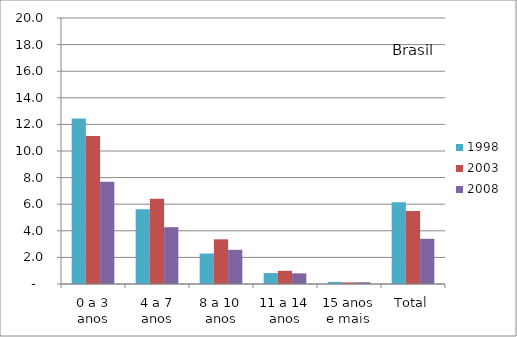
| Category | 1998 | 2003 | 2008 |
|---|---|---|---|
| 0 a 3 anos | 12.44 | 11.12 | 7.68 |
| 4 a 7 anos | 5.62 | 6.41 | 4.27 |
| 8 a 10 anos | 2.29 | 3.36 | 2.57 |
| 11 a 14 anos | 0.82 | 0.99 | 0.8 |
| 15 anos e mais | 0.16 | 0.12 | 0.13 |
| Total | 6.15 | 5.48 | 3.4 |